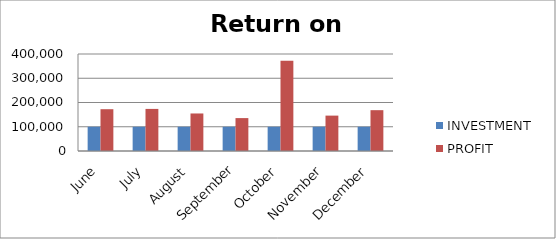
| Category | INVESTMENT  | PROFIT |
|---|---|---|
| June | 100000 | 172357 |
| July | 100000 | 173565 |
| August | 100000 | 154755 |
| September | 100000 | 135705 |
| October | 100000 | 372639 |
| November | 100000 | 145925 |
| December | 100000 | 168357 |